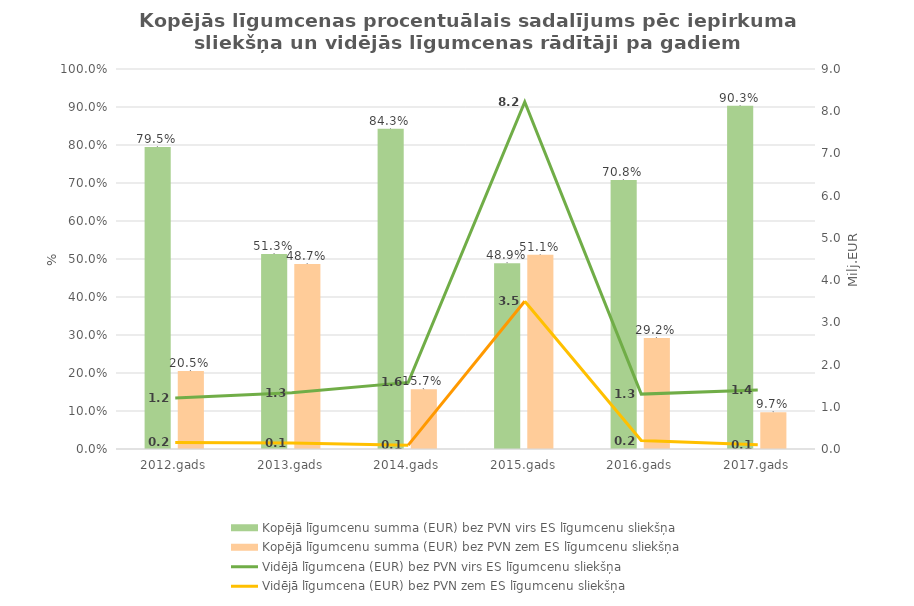
| Category | Kopējā līgumcenu summa (EUR) bez PVN |
|---|---|
| 2012.gads | 0.205 |
| 2013.gads | 0.487 |
| 2014.gads | 0.157 |
| 2015.gads | 0.511 |
| 2016.gads | 0.292 |
| 2017.gads | 0.097 |